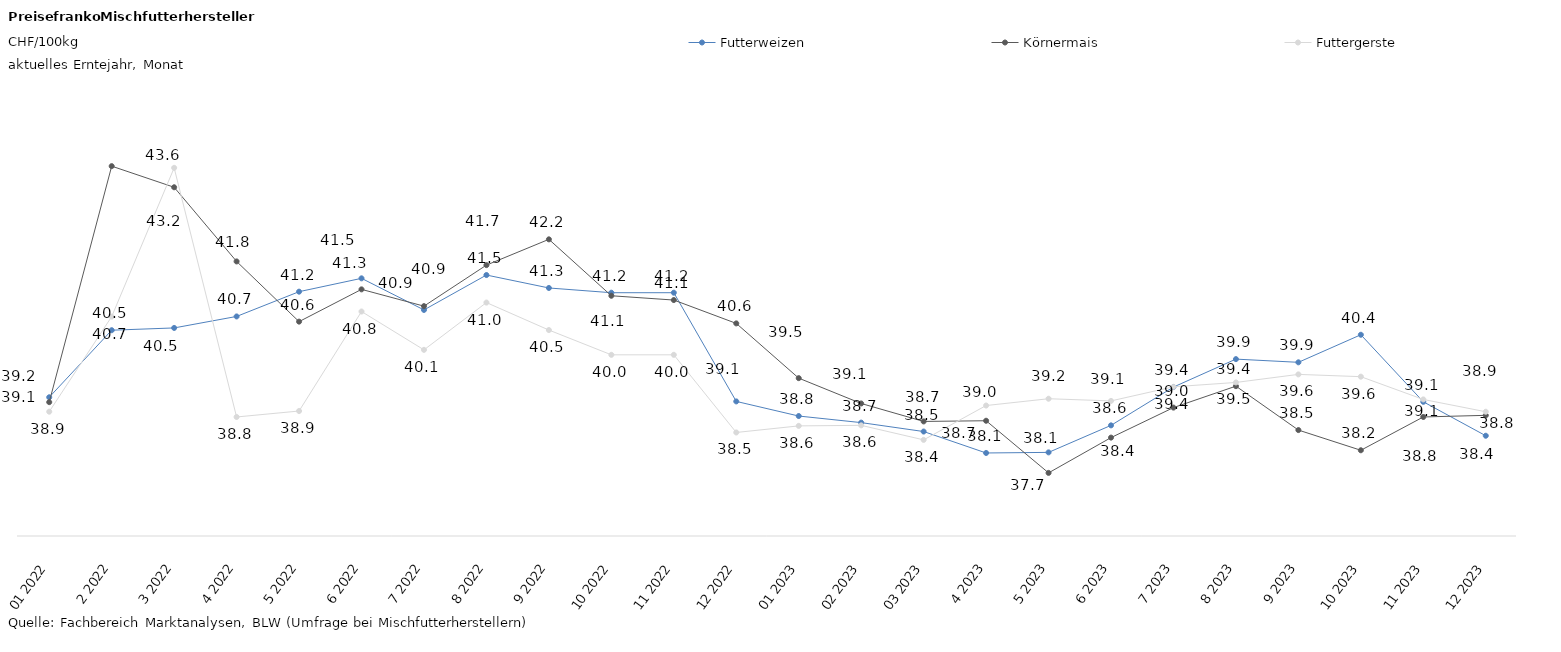
| Category | Futterweizen | Körnermais | Futtergerste |
|---|---|---|---|
| 01 2022 | 39.18 | 39.086 | 38.902 |
| 2 2022 | 40.475 | 43.645 | 40.738 |
| 3 2022 | 40.52 | 43.237 | 43.612 |
| 4 2022 | 40.741 | 41.804 | 38.799 |
| 5 2022 | 41.22 | 40.641 | 38.914 |
| 6 2022 | 41.477 | 41.265 | 40.837 |
| 7 2022 | 40.867 | 40.94 | 40.096 |
| 8 2022 | 41.541 | 41.733 | 41.009 |
| 9 2022 | 41.291 | 42.231 | 40.479 |
| 10 2022 | 41.2 | 41.141 | 40 |
| 11 2022 | 41.2 | 41.058 | 40 |
| 12 2022 | 39.1 | 40.607 | 38.5 |
| 01 2023 | 38.817 | 39.549 | 38.627 |
| 02 2023 | 38.69 | 39.06 | 38.638 |
| 03 2023 | 38.518 | 38.713 | 38.357 |
| 4 2023 | 38.104 | 38.726 | 39.02 |
| 5 2023 | 38.115 | 37.719 | 39.152 |
| 6 2023 | 38.637 | 38.401 | 39.11 |
| 7 2023 | 39.377 | 38.981 | 39.382 |
| 8 2023 | 39.917 | 39.395 | 39.466 |
| 9 2023 | 39.855 | 38.546 | 39.622 |
| 10 2023 | 40.387 | 38.156 | 39.578 |
| 11 2023 | 39.093 | 38.8 | 39.138 |
| 12 2023 | 38.437 | 38.831 | 38.9 |